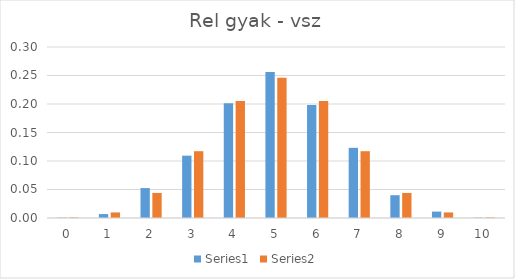
| Category | Series 0 | Series 1 |
|---|---|---|
| 0.0 | 0.001 | 0.001 |
| 1.0 | 0.007 | 0.01 |
| 2.0 | 0.052 | 0.044 |
| 3.0 | 0.109 | 0.117 |
| 4.0 | 0.201 | 0.205 |
| 5.0 | 0.256 | 0.246 |
| 6.0 | 0.198 | 0.205 |
| 7.0 | 0.123 | 0.117 |
| 8.0 | 0.04 | 0.044 |
| 9.0 | 0.011 | 0.01 |
| 10.0 | 0.001 | 0.001 |